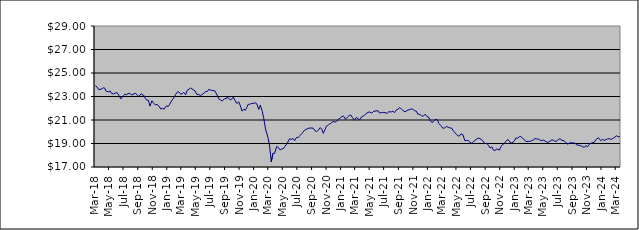
| Category | Series 0 |
|---|---|
| 2014-01-09 | 20.666 |
| 2014-01-17 | 20.724 |
| 2014-01-23 | 20.754 |
| 2014-01-31 | 20.538 |
| 2014-02-10 | 20.55 |
| 2014-02-14 | 20.67 |
| 2014-02-20 | 20.75 |
| 2014-02-28 | 20.867 |
| 2014-03-10 | 20.933 |
| 2014-03-14 | 20.735 |
| 2014-03-20 | 20.783 |
| 2014-03-26 | 20.75 |
| 2014-03-31 | 20.834 |
| 2014-04-09 | 20.834 |
| 2014-04-15 | 20.704 |
| 2014-04-24 | 20.882 |
| 2014-04-30 | 20.864 |
| 2014-05-08 | 20.894 |
| 2014-05-16 | 20.901 |
| 2014-05-22 | 20.916 |
| 2014-05-31 | 21.158 |
| 2014-06-09 | 21.254 |
| 2014-06-16 | 21.292 |
| 2014-06-20 | 21.373 |
| 2014-06-30 | 21.349 |
| 2014-07-09 | 21.404 |
| 2014-07-15 | 21.408 |
| 2014-07-22 | 21.373 |
| 2014-07-31 | 21.481 |
| 2014-08-11 | 21.163 |
| 2014-08-14 | 21.275 |
| 2014-08-21 | 21.422 |
| 2014-08-30 | 21.49 |
| 2014-09-08 | 21.526 |
| 2014-09-16 | 21.416 |
| 2014-09-23 | 21.419 |
| 2014-09-30 | 21.284 |
| 2014-10-09 | 21.092 |
| 2014-10-16 | 20.83 |
| 2014-10-23 | 20.989 |
| 2014-10-31 | 21.237 |
| 2014-11-10 | 21.374 |
| 2014-11-13 | 21.414 |
| 2014-11-20 | 21.463 |
| 2014-11-29 | 21.615 |
| 2014-12-10 | 21.551 |
| 2014-12-18 | 21.2 |
| 2014-12-23 | 21.522 |
| 2014-12-30 | 21.583 |
| 2015-01-08 | 21.22 |
| 2015-01-15 | 21.341 |
| 2015-01-30 | 21.559 |
| 2015-02-10 | 21.572 |
| 2015-02-16 | 21.742 |
| 2015-02-19 | 21.803 |
| 2015-02-28 | 21.937 |
| 2015-03-10 | 21.878 |
| 2015-03-13 | 21.911 |
| 2015-03-19 | 21.994 |
| 2015-03-27 | 21.938 |
| 2015-04-07 | 22.02 |
| 2015-04-16 | 22.192 |
| 2015-04-27 | 22.188 |
| 2015-05-08 | 21.935 |
| 2015-05-14 | 21.998 |
| 2015-05-21 | 22.2 |
| 2015-05-27 | 22.171 |
| 2015-06-03 | 22.151 |
| 2015-06-09 | 21.994 |
| 2015-06-15 | 22.021 |
| 2015-06-22 | 22.006 |
| 2015-06-26 | 22.121 |
| 2015-07-02 | 21.962 |
| 2015-07-09 | 21.831 |
| 2015-07-14 | 22.063 |
| 2015-07-23 | 22.162 |
| 2015-07-29 | 22 |
| 2015-08-06 | 22.186 |
| 2015-08-13 | 22.006 |
| 2015-08-20 | 21.939 |
| 2015-08-27 | 21.245 |
| 2015-09-03 | 21.294 |
| 2015-09-09 | 21.304 |
| 2015-09-15 | 21.325 |
| 2015-09-21 | 21.47 |
| 2015-09-28 | 21.222 |
| 2015-10-07 | 21.404 |
| 2015-10-13 | 21.558 |
| 2015-10-22 | 21.599 |
| 2015-10-28 | 21.742 |
| 2015-11-04 | 21.799 |
| 2015-11-13 | 21.658 |
| 2015-11-19 | 21.665 |
| 2015-11-27 | 21.73 |
| 2015-12-03 | 21.75 |
| 2015-12-10 | 21.462 |
| 2015-12-15 | 21.249 |
| 2015-12-23 | 21.385 |
| 2015-12-29 | 21.477 |
| 2016-01-07 | 21.222 |
| 2016-01-14 | 20.912 |
| 2016-01-21 | 20.454 |
| 2016-01-28 | 20.804 |
| 2016-02-04 | 20.723 |
| 2016-02-11 | 20.312 |
| 2016-02-18 | 20.531 |
| 2016-02-25 | 20.482 |
| 2016-03-03 | 20.907 |
| 2016-03-10 | 20.922 |
| 2016-03-16 | 21.067 |
| 2016-03-29 | 21.016 |
| 2016-04-07 | 20.886 |
| 2016-04-14 | 21.175 |
| 2016-04-28 | 21.406 |
| 2016-05-05 | 21.108 |
| 2016-05-12 | 21.218 |
| 2016-05-19 | 21.383 |
| 2016-05-30 | 21.562 |
| 2016-06-03 | 21.52 |
| 2016-06-09 | 21.596 |
| 2016-06-15 | 21.178 |
| 2016-06-23 | 21.328 |
| 2016-06-29 | 21.059 |
| 2016-07-11 | 21.326 |
| 2016-07-14 | 21.563 |
| 2016-07-21 | 21.675 |
| 2016-07-28 | 21.663 |
| 2016-08-04 | 21.548 |
| 2016-08-11 | 21.725 |
| 2016-08-16 | 21.758 |
| 2016-08-24 | 21.706 |
| 2016-08-30 | 21.669 |
| 2016-09-08 | 21.8 |
| 2016-09-15 | 21.439 |
| 2016-09-22 | 21.686 |
| 2016-09-29 | 21.832 |
| 2016-10-06 | 21.816 |
| 2016-10-13 | 21.734 |
| 2016-10-20 | 21.819 |
| 2016-10-28 | 21.738 |
| 2016-11-03 | 21.632 |
| 2016-11-10 | 21.582 |
| 2016-11-15 | 21.315 |
| 2016-11-23 | 21.396 |
| 2016-11-29 | 21.374 |
| 2016-12-07 | 21.539 |
| 2016-12-14 | 21.763 |
| 2016-12-21 | 21.71 |
| 2016-12-28 | 21.701 |
| 2017-01-05 | 21.895 |
| 2017-01-16 | 21.981 |
| 2017-01-23 | 21.918 |
| 2017-01-30 | 22.061 |
| 2017-02-06 | 22.14 |
| 2017-02-13 | 22.243 |
| 2017-02-20 | 22.313 |
| 2017-02-27 | 22.378 |
| 2017-03-06 | 22.357 |
| 2017-03-13 | 22.281 |
| 2017-03-20 | 22.463 |
| 2017-03-27 | 22.367 |
| 2017-03-30 | 22.472 |
| 2017-04-10 | 22.469 |
| 2017-04-18 | 22.375 |
| 2017-04-24 | 22.479 |
| 2017-04-28 | 22.666 |
| 2017-05-08 | 22.645 |
| 2017-05-15 | 22.624 |
| 2017-05-22 | 22.419 |
| 2017-05-30 | 22.563 |
| 2017-06-06 | 22.664 |
| 2017-06-12 | 22.746 |
| 2017-06-15 | 22.757 |
| 2017-06-20 | 22.756 |
| 2017-06-29 | 22.709 |
| 2017-07-04 | 22.742 |
| 2017-07-10 | 22.637 |
| 2017-07-14 | 22.734 |
| 2017-07-19 | 22.762 |
| 2017-07-24 | 22.795 |
| 2017-07-28 | 22.833 |
| 2017-08-03 | 22.858 |
| 2017-08-09 | 22.839 |
| 2017-08-14 | 22.661 |
| 2017-08-21 | 22.63 |
| 2017-08-24 | 22.655 |
| 2017-08-30 | 22.659 |
| 2017-09-07 | 22.724 |
| 2017-09-14 | 22.906 |
| 2017-09-20 | 22.994 |
| 2017-09-29 | 23.048 |
| 2017-10-05 | 23.176 |
| 2017-10-11 | 23.201 |
| 2017-10-16 | 23.212 |
| 2017-10-23 | 23.262 |
| 2017-10-30 | 23.251 |
| 2017-11-07 | 22.993 |
| 2017-11-15 | 22.86 |
| 2017-11-23 | 23.223 |
| 2017-11-29 | 23.282 |
| 2017-12-07 | 23.273 |
| 2017-12-13 | 23.357 |
| 2017-12-18 | 23.417 |
| 2017-12-28 | 23.583 |
| 2018-01-08 | 23.882 |
| 2018-01-17 | 24.082 |
| 2018-01-24 | 24.257 |
| 2018-01-30 | 24.271 |
| 2018-02-05 | 24.022 |
| 2018-02-13 | 23.612 |
| 2018-02-19 | 23.775 |
| 2018-02-27 | 23.86 |
| 2018-03-07 | 23.778 |
| 2018-03-14 | 23.922 |
| 2018-03-21 | 23.82 |
| 2018-03-29 | 23.571 |
| 2018-04-10 | 23.654 |
| 2018-04-16 | 23.737 |
| 2018-04-23 | 23.713 |
| 2018-04-27 | 23.478 |
| 2018-05-10 | 23.379 |
| 2018-05-15 | 23.476 |
| 2018-05-22 | 23.257 |
| 2018-05-30 | 23.217 |
| 2018-06-06 | 23.29 |
| 2018-06-13 | 23.342 |
| 2018-06-20 | 23.13 |
| 2018-06-29 | 22.795 |
| 2018-07-10 | 23.074 |
| 2018-07-16 | 23.195 |
| 2018-07-23 | 23.15 |
| 2018-07-30 | 23.252 |
| 2018-08-07 | 23.263 |
| 2018-08-13 | 23.134 |
| 2018-08-24 | 23.22 |
| 2018-08-30 | 23.285 |
| 2018-09-06 | 23.118 |
| 2018-09-13 | 23.004 |
| 2018-09-24 | 23.249 |
| 2018-09-28 | 23.124 |
| 2018-10-04 | 23.105 |
| 2018-10-10 | 22.844 |
| 2018-10-16 | 22.695 |
| 2018-10-23 | 22.685 |
| 2018-10-30 | 22.177 |
| 2018-11-07 | 22.641 |
| 2018-11-15 | 22.418 |
| 2018-11-21 | 22.291 |
| 2018-11-29 | 22.324 |
| 2018-12-07 | 22.174 |
| 2018-12-14 | 21.937 |
| 2018-12-21 | 21.995 |
| 2018-12-28 | 21.921 |
| 2019-01-08 | 22.216 |
| 2019-01-14 | 22.137 |
| 2019-01-21 | 22.343 |
| 2019-01-30 | 22.677 |
| 2019-02-11 | 22.991 |
| 2019-02-14 | 23.148 |
| 2019-02-21 | 23.363 |
| 2019-02-27 | 23.417 |
| 2019-03-07 | 23.219 |
| 2019-03-14 | 23.215 |
| 2019-03-21 | 23.355 |
| 2019-03-29 | 23.144 |
| 2019-04-04 | 23.52 |
| 2019-04-12 | 23.623 |
| 2019-04-18 | 23.722 |
| 2019-04-29 | 23.593 |
| 2019-05-08 | 23.456 |
| 2019-05-15 | 23.177 |
| 2019-05-23 | 23.173 |
| 2019-05-30 | 23.075 |
| 2019-06-10 | 23.23 |
| 2019-06-14 | 23.2 |
| 2019-06-21 | 23.421 |
| 2019-06-28 | 23.429 |
| 2019-07-04 | 23.606 |
| 2019-07-15 | 23.519 |
| 2019-07-22 | 23.512 |
| 2019-07-30 | 23.471 |
| 2019-08-06 | 23.206 |
| 2019-08-16 | 22.785 |
| 2019-08-22 | 22.717 |
| 2019-08-30 | 22.616 |
| 2019-09-09 | 22.825 |
| 2019-09-16 | 22.807 |
| 2019-09-20 | 22.982 |
| 2019-09-27 | 22.808 |
| 2019-10-03 | 22.725 |
| 2019-10-09 | 22.773 |
| 2019-10-15 | 22.938 |
| 2019-10-30 | 22.399 |
| 2019-11-07 | 22.548 |
| 2019-11-14 | 22.215 |
| 2019-11-21 | 21.756 |
| 2019-11-29 | 21.912 |
| 2019-12-05 | 21.832 |
| 2019-12-11 | 22.065 |
| 2019-12-17 | 22.342 |
| 2019-12-23 | 22.325 |
| 2019-12-30 | 22.41 |
| 2020-01-07 | 22.401 |
| 2020-01-15 | 22.468 |
| 2020-01-22 | 22.384 |
| 2020-01-30 | 21.899 |
| 2020-02-06 | 22.266 |
| 2020-02-14 | 21.742 |
| 2020-02-20 | 21.186 |
| 2020-02-28 | 20.217 |
| 2020-03-09 | 19.511 |
| 2020-03-16 | 18.797 |
| 2020-03-23 | 17.441 |
| 2020-03-30 | 18.158 |
| 2020-04-06 | 18.162 |
| 2020-04-15 | 18.75 |
| 2020-04-23 | 18.628 |
| 2020-04-29 | 18.453 |
| 2020-05-06 | 18.531 |
| 2020-05-14 | 18.586 |
| 2020-05-20 | 18.774 |
| 2020-05-29 | 19.006 |
| 2020-06-08 | 19.408 |
| 2020-06-15 | 19.341 |
| 2020-06-22 | 19.438 |
| 2020-06-29 | 19.242 |
| 2020-07-07 | 19.514 |
| 2020-07-15 | 19.514 |
| 2020-07-22 | 19.686 |
| 2020-07-29 | 19.835 |
| 2020-08-10 | 20.129 |
| 2020-08-17 | 20.206 |
| 2020-08-21 | 20.129 |
| 2020-08-28 | 20.308 |
| 2020-09-07 | 20.319 |
| 2020-09-15 | 20.309 |
| 2020-09-22 | 20.097 |
| 2020-09-29 | 20.013 |
| 2020-10-07 | 20.131 |
| 2020-10-15 | 20.351 |
| 2020-10-21 | 20.227 |
| 2020-10-28 | 19.866 |
| 2020-11-10 | 20.48 |
| 2020-11-16 | 20.536 |
| 2020-11-20 | 20.626 |
| 2020-11-27 | 20.695 |
| 2020-12-08 | 20.877 |
| 2020-12-15 | 20.825 |
| 2020-12-22 | 20.87 |
| 2020-12-30 | 21.058 |
| 2021-01-07 | 21.173 |
| 2021-01-15 | 21.31 |
| 2021-01-21 | 21.329 |
| 2021-01-29 | 21.054 |
| 2021-02-08 | 21.277 |
| 2021-02-15 | 21.405 |
| 2021-02-22 | 21.395 |
| 2021-02-26 | 21.234 |
| 2021-03-08 | 20.98 |
| 2021-03-15 | 21.211 |
| 2021-03-22 | 21.136 |
| 2021-03-30 | 21.022 |
| 2021-04-08 | 21.29 |
| 2021-04-15 | 21.337 |
| 2021-04-22 | 21.47 |
| 2021-04-29 | 21.593 |
| 2021-05-10 | 21.695 |
| 2021-05-17 | 21.591 |
| 2021-05-24 | 21.656 |
| 2021-05-28 | 21.746 |
| 2021-06-07 | 21.768 |
| 2021-06-15 | 21.794 |
| 2021-06-22 | 21.578 |
| 2021-06-29 | 21.629 |
| 2021-07-07 | 21.646 |
| 2021-07-15 | 21.623 |
| 2021-07-23 | 21.566 |
| 2021-07-30 | 21.704 |
| 2021-08-10 | 21.687 |
| 2021-08-17 | 21.748 |
| 2021-08-23 | 21.62 |
| 2021-08-30 | 21.832 |
| 2021-09-07 | 21.924 |
| 2021-09-15 | 22.064 |
| 2021-09-22 | 21.915 |
| 2021-09-29 | 21.792 |
| 2021-10-07 | 21.698 |
| 2021-10-15 | 21.813 |
| 2021-10-22 | 21.864 |
| 2021-10-29 | 21.921 |
| 2021-11-08 | 21.927 |
| 2021-11-15 | 21.797 |
| 2021-11-23 | 21.754 |
| 2021-11-29 | 21.495 |
| 2021-12-08 | 21.492 |
| 2021-12-15 | 21.35 |
| 2021-12-22 | 21.322 |
| 2021-12-30 | 21.488 |
| 2022-01-07 | 21.289 |
| 2022-01-14 | 21.239 |
| 2022-01-20 | 20.964 |
| 2022-01-28 | 20.769 |
| 2022-02-07 | 20.968 |
| 2022-02-14 | 21.08 |
| 2022-02-21 | 20.965 |
| 2022-02-25 | 20.711 |
| 2022-03-07 | 20.514 |
| 2022-03-14 | 20.308 |
| 2022-03-21 | 20.313 |
| 2022-03-30 | 20.457 |
| 2022-04-07 | 20.372 |
| 2022-04-14 | 20.328 |
| 2022-04-21 | 20.304 |
| 2022-04-29 | 20.02 |
| 2022-05-09 | 19.826 |
| 2022-05-16 | 19.657 |
| 2022-05-23 | 19.629 |
| 2022-05-30 | 19.816 |
| 2022-06-07 | 19.757 |
| 2022-06-15 | 19.234 |
| 2022-06-22 | 19.27 |
| 2022-06-29 | 19.245 |
| 2022-07-07 | 19.101 |
| 2022-07-14 | 19.015 |
| 2022-07-21 | 19.122 |
| 2022-07-29 | 19.304 |
| 2022-08-05 | 19.397 |
| 2022-08-12 | 19.465 |
| 2022-08-22 | 19.361 |
| 2022-08-30 | 19.21 |
| 2022-09-07 | 18.992 |
| 2022-09-15 | 19.025 |
| 2022-09-22 | 18.844 |
| 2022-09-29 | 18.618 |
| 2022-10-07 | 18.711 |
| 2022-10-13 | 18.44 |
| 2022-10-20 | 18.418 |
| 2022-10-28 | 18.541 |
| 2022-11-07 | 18.439 |
| 2022-11-14 | 18.727 |
| 2022-11-21 | 18.913 |
| 2022-11-29 | 19.022 |
| 2022-12-07 | 19.251 |
| 2022-12-14 | 19.338 |
| 2022-12-21 | 19.12 |
| 2022-12-29 | 19.041 |
| 2023-01-09 | 19.208 |
| 2023-01-16 | 19.471 |
| 2023-01-23 | 19.455 |
| 2023-01-30 | 19.581 |
| 2023-02-06 | 19.584 |
| 2023-02-13 | 19.448 |
| 2023-02-20 | 19.342 |
| 2023-02-27 | 19.157 |
| 2023-03-09 | 19.184 |
| 2023-03-16 | 19.174 |
| 2023-03-23 | 19.25 |
| 2023-03-30 | 19.299 |
| 2023-04-06 | 19.415 |
| 2023-04-13 | 19.381 |
| 2023-04-20 | 19.379 |
| 2023-04-28 | 19.27 |
| 2023-05-04 | 19.235 |
| 2023-05-11 | 19.293 |
| 2023-05-18 | 19.211 |
| 2023-05-30 | 19.081 |
| 2023-06-08 | 19.19 |
| 2023-06-15 | 19.298 |
| 2023-06-22 | 19.293 |
| 2023-06-27 | 19.192 |
| 2023-07-06 | 19.205 |
| 2023-07-13 | 19.336 |
| 2023-07-20 | 19.402 |
| 2023-07-28 | 19.276 |
| 2023-08-07 | 19.222 |
| 2023-08-14 | 19.079 |
| 2023-08-21 | 18.945 |
| 2023-08-30 | 19.052 |
| 2023-09-07 | 19.072 |
| 2023-09-14 | 19.039 |
| 2023-09-21 | 19.023 |
| 2023-09-29 | 18.881 |
| 2023-10-09 | 18.843 |
| 2023-10-16 | 18.804 |
| 2023-10-23 | 18.728 |
| 2023-10-30 | 18.684 |
| 2023-11-06 | 18.805 |
| 2023-11-13 | 18.73 |
| 2023-11-20 | 18.922 |
| 2023-11-29 | 19.045 |
| 2023-12-04 | 19.075 |
| 2023-12-11 | 19.098 |
| 2023-12-18 | 19.33 |
| 2023-12-29 | 19.488 |
| 2024-01-08 | 19.238 |
| 2024-01-15 | 19.359 |
| 2024-01-22 | 19.261 |
| 2024-01-30 | 19.339 |
| 2024-02-05 | 19.384 |
| 2024-02-12 | 19.421 |
| 2024-02-19 | 19.346 |
| 2024-02-28 | 19.431 |
| 2024-03-07 | 19.546 |
| 2024-03-14 | 19.653 |
| 2024-03-21 | 19.565 |
| 2024-03-28 | 19.605 |